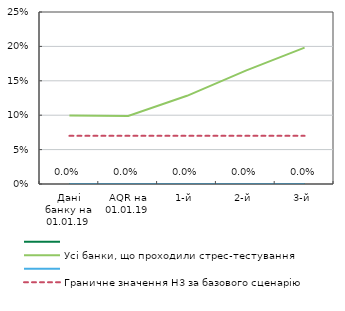
| Category | Series 0 | Усі банки, що проходили стрес-тестування | Series 3 | Граничне значення Н3 за базового сценарію |
|---|---|---|---|---|
| Дані банку на 01.01.19 | 0 | 0.1 | 0 | 0.07 |
| AQR на 01.01.19 | 0 | 0.099 | 0 | 0.07 |
| 1-й | 0 | 0.128 | 0 | 0.07 |
| 2-й | 0 | 0.165 | 0 | 0.07 |
| 3-й | 0 | 0.198 | 0 | 0.07 |